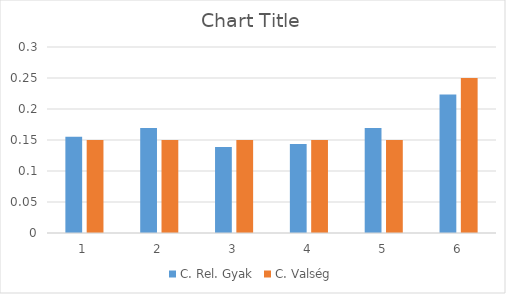
| Category | C. Rel. Gyak | C. Valség |
|---|---|---|
| 0 | 0.155 | 0.15 |
| 1 | 0.169 | 0.15 |
| 2 | 0.139 | 0.15 |
| 3 | 0.144 | 0.15 |
| 4 | 0.169 | 0.15 |
| 5 | 0.224 | 0.25 |